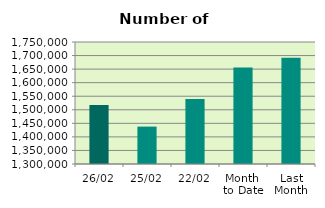
| Category | Series 0 |
|---|---|
| 26/02 | 1517964 |
| 25/02 | 1437964 |
| 22/02 | 1539988 |
| Month 
to Date | 1656284.111 |
| Last
Month | 1692009 |